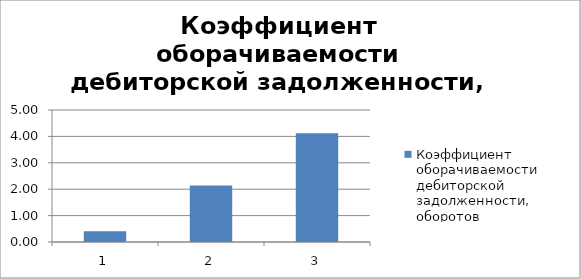
| Category | Коэффициент оборачиваемости дебиторской задолженности, оборотов |
|---|---|
| 0 | 0.411 |
| 1 | 2.136 |
| 2 | 4.118 |